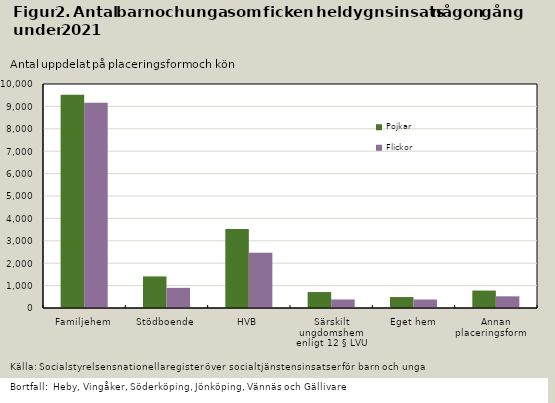
| Category | Pojkar | Flickor |
|---|---|---|
| Familjehem | 9515 | 9168 |
| Stödboende | 1409 | 899 |
| HVB | 3530 | 2463 |
| Särskilt ungdomshem enligt 12 § LVU | 712 | 380 |
| Eget hem | 489 | 378 |
| Annan placeringsform        | 779 | 521 |